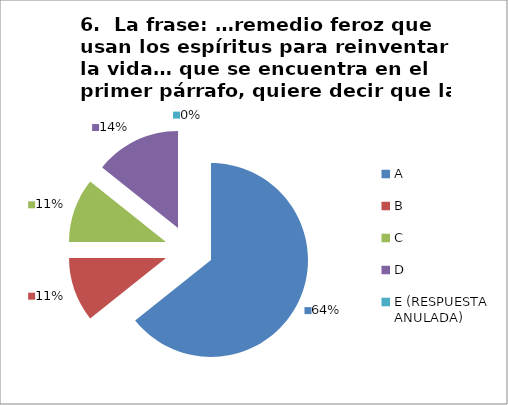
| Category | CANTIDAD DE RESPUESTAS PREGUNTA (6) | PORCENTAJE |
|---|---|---|
| A | 18 | 0.643 |
| B | 3 | 0.107 |
| C | 3 | 0.107 |
| D | 4 | 0.143 |
| E (RESPUESTA ANULADA) | 0 | 0 |